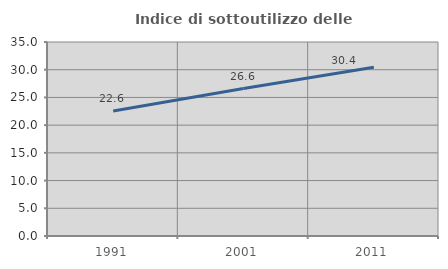
| Category | Indice di sottoutilizzo delle abitazioni  |
|---|---|
| 1991.0 | 22.567 |
| 2001.0 | 26.611 |
| 2011.0 | 30.43 |